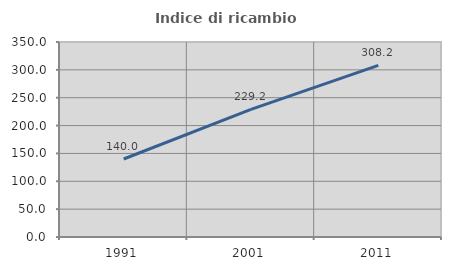
| Category | Indice di ricambio occupazionale  |
|---|---|
| 1991.0 | 140 |
| 2001.0 | 229.167 |
| 2011.0 | 308.163 |